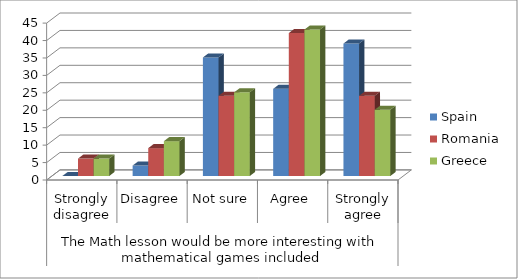
| Category | Spain | Romania | Greece |
|---|---|---|---|
| 0 | 0 | 5 | 5 |
| 1 | 3 | 8 | 10 |
| 2 | 34 | 23 | 24 |
| 3 | 25 | 41 | 42 |
| 4 | 38 | 23 | 19 |